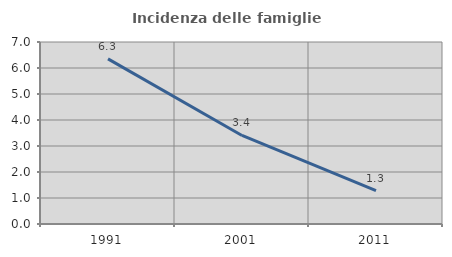
| Category | Incidenza delle famiglie numerose |
|---|---|
| 1991.0 | 6.349 |
| 2001.0 | 3.405 |
| 2011.0 | 1.28 |